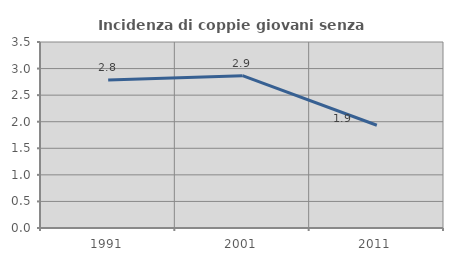
| Category | Incidenza di coppie giovani senza figli |
|---|---|
| 1991.0 | 2.787 |
| 2001.0 | 2.867 |
| 2011.0 | 1.934 |